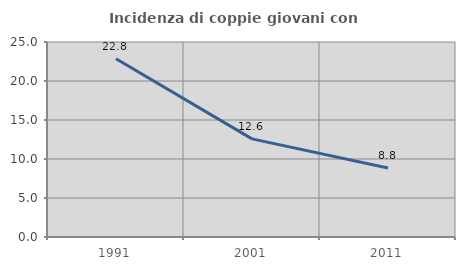
| Category | Incidenza di coppie giovani con figli |
|---|---|
| 1991.0 | 22.846 |
| 2001.0 | 12.583 |
| 2011.0 | 8.844 |